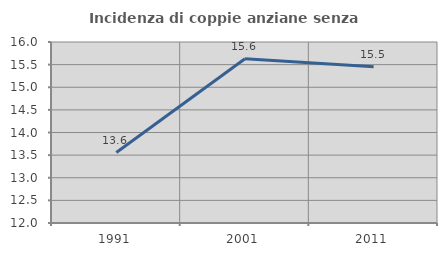
| Category | Incidenza di coppie anziane senza figli  |
|---|---|
| 1991.0 | 13.557 |
| 2001.0 | 15.629 |
| 2011.0 | 15.45 |